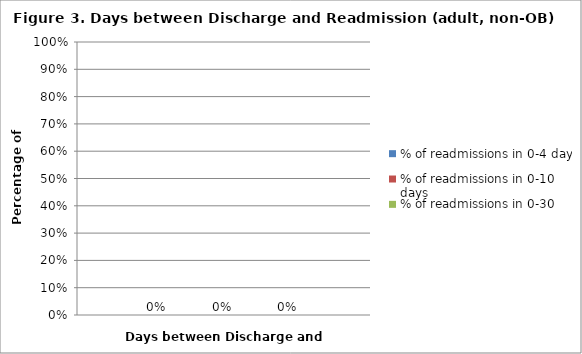
| Category | % of readmissions in 0-4 days | % of readmissions in 0-10 days | % of readmissions in 0-30 days |
|---|---|---|---|
| All | 0 | 0 | 0 |